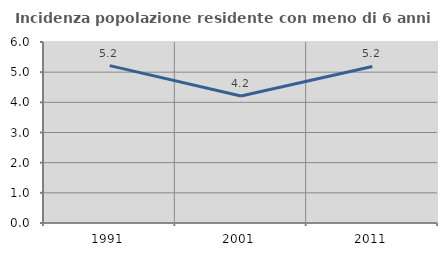
| Category | Incidenza popolazione residente con meno di 6 anni |
|---|---|
| 1991.0 | 5.217 |
| 2001.0 | 4.211 |
| 2011.0 | 5.19 |